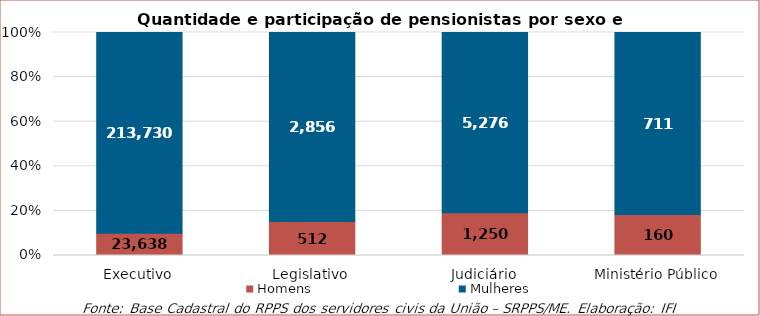
| Category | Homens | Mulheres |
|---|---|---|
| Executivo | 23638 | 213730 |
| Legislativo | 512 | 2856 |
| Judiciário | 1250 | 5276 |
| Ministério Público | 160 | 711 |